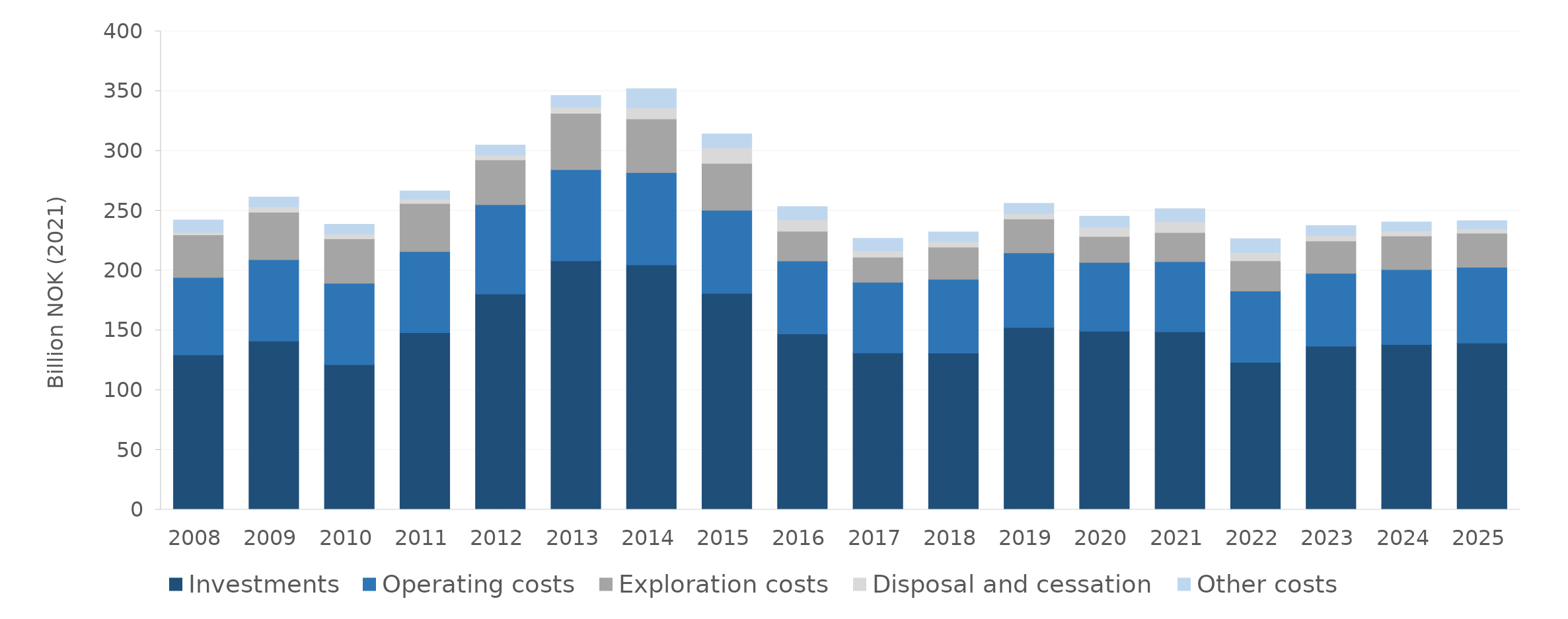
| Category | Investments | Operating costs | Exploration costs | Disposal and cessation | Other costs |
|---|---|---|---|---|---|
| 2008.0 | 129.364 | 64.862 | 35.614 | 2.223 | 10.228 |
| 2009.0 | 141.025 | 68.117 | 39.586 | 4.653 | 8.139 |
| 2010.0 | 121.241 | 68.118 | 37.099 | 4.095 | 8.157 |
| 2011.0 | 148.07 | 67.822 | 40.158 | 3.773 | 6.743 |
| 2012.0 | 180.353 | 74.752 | 37.418 | 4.054 | 8.416 |
| 2013.0 | 208.196 | 76.207 | 47.095 | 5.133 | 9.82 |
| 2014.0 | 204.756 | 77.155 | 44.872 | 9.314 | 15.975 |
| 2015.0 | 180.873 | 69.58 | 39.249 | 12.974 | 11.558 |
| 2016.0 | 146.951 | 61.075 | 24.832 | 9.578 | 10.972 |
| 2017.0 | 131.018 | 59.238 | 20.899 | 5.396 | 10.315 |
| 2018.0 | 130.946 | 61.702 | 26.928 | 4.501 | 8.186 |
| 2019.0 | 152.3 | 62.516 | 28.235 | 4.629 | 8.542 |
| 2020.0 | 149.338 | 57.469 | 21.632 | 7.71 | 9.285 |
| 2021.0 | 148.742 | 58.755 | 24.203 | 9.178 | 10.807 |
| 2022.0 | 123.213 | 59.635 | 25.324 | 6.87 | 11.649 |
| 2023.0 | 136.775 | 60.94 | 26.959 | 4.746 | 8.11 |
| 2024.0 | 138.068 | 62.721 | 28.133 | 4.202 | 7.503 |
| 2025.0 | 139.366 | 63.438 | 28.365 | 3.575 | 7.004 |